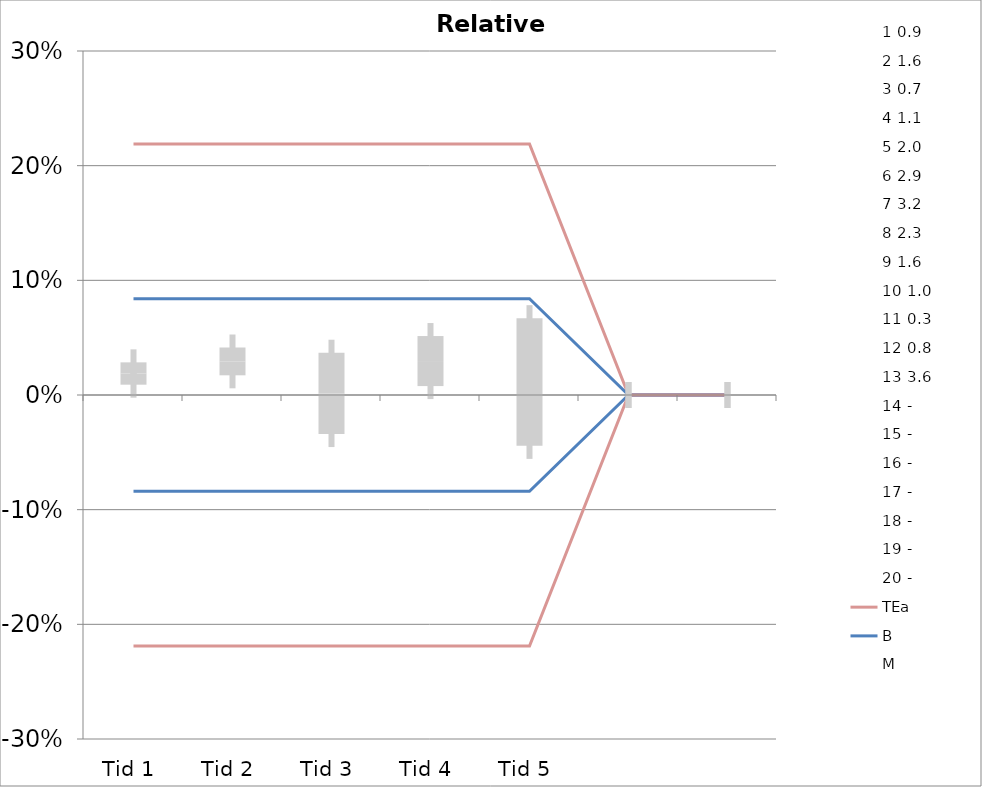
| Category | 1 | 2 | 3 | 4 | 5 | 6 | 7 | 8 | 9 | 10 | 11 | 12 | 13 | 14 | 15 | 16 | 17 | 18 | 19 | 20 | TEa | B | -B | -TEa | M |
|---|---|---|---|---|---|---|---|---|---|---|---|---|---|---|---|---|---|---|---|---|---|---|---|---|---|
| Tid 1 | 0.004 | 0.041 | 0.019 | -0.006 | 0.051 | 0.024 | 0.025 | 0.009 | 0.024 | 0.019 | 0 | 0.026 | 0.006 | 0 | 0 | 0 | 0 | 0 | 0 | 0 | 0.219 | 0.084 | -0.084 | -0.219 | 0.019 |
| Tid 2 | 0.033 | 0.039 | 0.014 | 0.009 | 0.035 | 0.01 | 0.072 | 0.04 | 0.03 | 0.029 | 0 | 0.039 | 0 | 0 | 0 | 0 | 0 | 0 | 0 | 0 | 0.219 | 0.084 | -0.084 | -0.219 | 0.029 |
| Tid 3 | 0 | 0.077 | -0.043 | -0.11 | 0.025 | 0 | 0 | 0.018 | 0.018 | 0.029 | 0 | 0 | 0 | 0 | 0 | 0 | 0 | 0 | 0 | 0 | 0.219 | 0.084 | -0.084 | -0.219 | 0.001 |
| Tid 4 | 0.056 | 0.065 | 0.014 | 0.009 | 0.05 | 0.069 | 0.05 | 0 | 0 | 0.01 | -0.036 | 0.039 | 0 | 0 | 0 | 0 | 0 | 0 | 0 | 0 | 0.219 | 0.084 | -0.084 | -0.219 | 0.03 |
| Tid 5 | 0.078 | 0.084 | 0 | 0.046 | -0.12 | 0.014 | 0.028 | 0 | 0 | -0.039 | 0 | 0 | 0 | 0 | 0 | 0 | 0 | 0 | 0 | 0 | 0.219 | 0.084 | -0.084 | -0.219 | 0.011 |